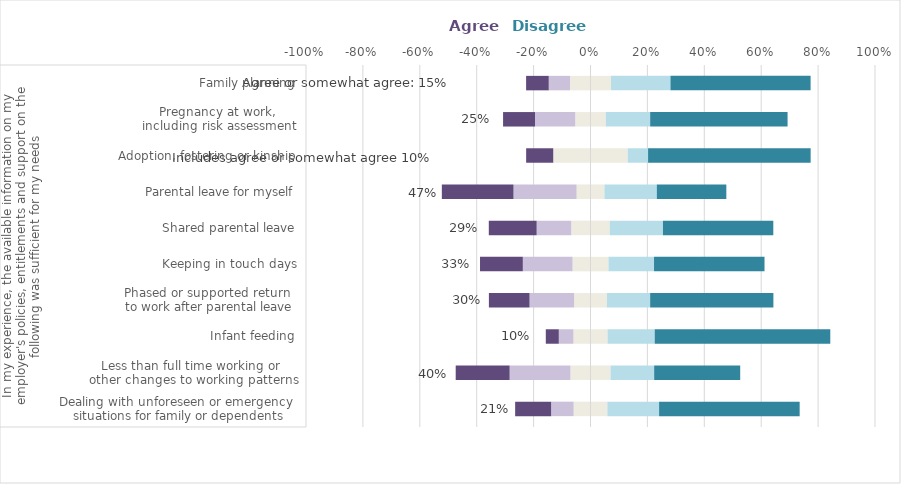
| Category | Neither agree nor disagree | Somewhat agree | Agree | Somewhat disagree | Disagree |
|---|---|---|---|---|---|
| 0 | 0.059 | -0.079 | -0.126 | 0.182 | 0.494 |
| 1 | 0.071 | -0.214 | -0.19 | 0.153 | 0.302 |
| 2 | 0.06 | -0.051 | -0.046 | 0.166 | 0.617 |
| 3 | 0.058 | -0.157 | -0.143 | 0.152 | 0.433 |
| 4 | 0.063 | -0.175 | -0.15 | 0.16 | 0.388 |
| 5 | 0.068 | -0.121 | -0.168 | 0.187 | 0.388 |
| 6 | 0.049 | -0.222 | -0.252 | 0.184 | 0.244 |
| 7 | 0.131 | 0 | -0.095 | 0.071 | 0.571 |
| 8 | 0.054 | -0.141 | -0.112 | 0.156 | 0.483 |
| 9 | 0.072 | -0.075 | -0.08 | 0.209 | 0.493 |